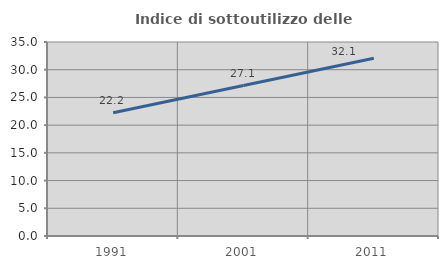
| Category | Indice di sottoutilizzo delle abitazioni  |
|---|---|
| 1991.0 | 22.239 |
| 2001.0 | 27.136 |
| 2011.0 | 32.085 |